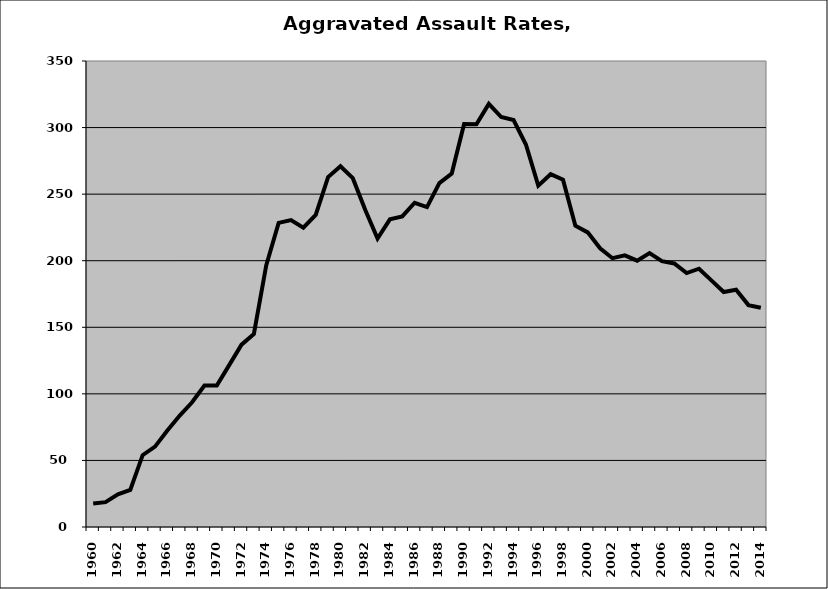
| Category | Aggravated Assault |
|---|---|
| 1960.0 | 17.629 |
| 1961.0 | 18.677 |
| 1962.0 | 24.551 |
| 1963.0 | 27.803 |
| 1964.0 | 53.954 |
| 1965.0 | 60.368 |
| 1966.0 | 72.416 |
| 1967.0 | 83.738 |
| 1968.0 | 93.651 |
| 1969.0 | 106.261 |
| 1970.0 | 106.302 |
| 1971.0 | 121.6 |
| 1972.0 | 136.974 |
| 1973.0 | 145.028 |
| 1974.0 | 196.605 |
| 1975.0 | 228.386 |
| 1976.0 | 230.537 |
| 1977.0 | 224.768 |
| 1978.0 | 234.393 |
| 1979.0 | 262.787 |
| 1980.0 | 270.973 |
| 1981.0 | 262.013 |
| 1982.0 | 238.304 |
| 1983.0 | 216.698 |
| 1984.0 | 231.111 |
| 1985.0 | 233.273 |
| 1986.0 | 243.536 |
| 1987.0 | 240.238 |
| 1988.0 | 258.281 |
| 1989.0 | 265.511 |
| 1990.0 | 302.69 |
| 1991.0 | 302.531 |
| 1992.0 | 317.776 |
| 1993.0 | 307.916 |
| 1994.0 | 305.615 |
| 1995.0 | 287.277 |
| 1996.0 | 256.407 |
| 1997.0 | 264.955 |
| 1998.0 | 260.837 |
| 1999.0 | 226.289 |
| 2000.0 | 221.288 |
| 2001.0 | 209.314 |
| 2002.0 | 201.894 |
| 2003.0 | 204.019 |
| 2004.0 | 200.047 |
| 2005.0 | 205.677 |
| 2006.0 | 199.662 |
| 2007.0 | 197.931 |
| 2008.0 | 190.708 |
| 2009.0 | 193.992 |
| 2010.0 | 185.262 |
| 2011.0 | 176.484 |
| 2012.0 | 178.164 |
| 2013.0 | 166.668 |
| 2014.0 | 164.653 |